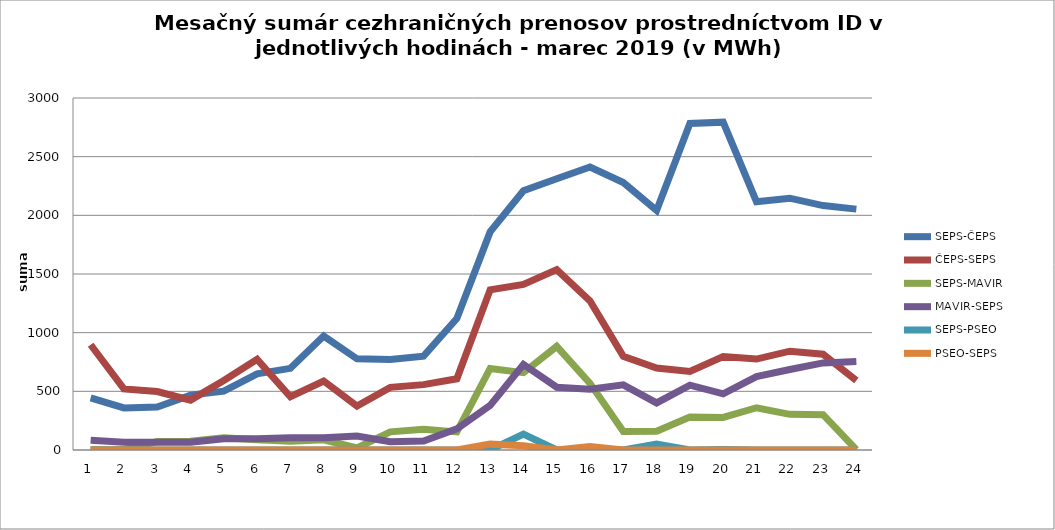
| Category | SEPS-ČEPS | ČEPS-SEPS | SEPS-MAVIR | MAVIR-SEPS | SEPS-PSEO | PSEO-SEPS |
|---|---|---|---|---|---|---|
| 1.0 | 445 | 897 | 2 | 84 | 0 | 0 |
| 2.0 | 359 | 521 | 2 | 66 | 0 | 0 |
| 3.0 | 366 | 498 | 73 | 67 | 0 | 0 |
| 4.0 | 468 | 425 | 75 | 66 | 0 | 0 |
| 5.0 | 501 | 592 | 105 | 96 | 0 | 0 |
| 6.0 | 649 | 772 | 87 | 95 | 0 | 0 |
| 7.0 | 696 | 454 | 74 | 104 | 0 | 0 |
| 8.0 | 971 | 588 | 87 | 104 | 0 | 0 |
| 9.0 | 777 | 375 | 17 | 119 | 0 | 0 |
| 10.0 | 771 | 534 | 155 | 70 | 0 | 0 |
| 11.0 | 800 | 557 | 177 | 76 | 0 | 0 |
| 12.0 | 1121 | 607 | 154 | 180 | 0 | 0 |
| 13.0 | 1859 | 1365 | 695 | 380 | 0 | 50 |
| 14.0 | 2209 | 1411 | 659 | 729 | 135 | 36 |
| 15.0 | 2312 | 1537 | 883 | 535 | 0 | 0 |
| 16.0 | 2412 | 1271 | 568 | 518 | 0 | 30 |
| 17.0 | 2279 | 799 | 157 | 555 | 0 | 0 |
| 18.0 | 2041 | 699 | 160 | 401 | 50 | 1 |
| 19.0 | 2783 | 670 | 282 | 552 | 0 | 0 |
| 20.0 | 2794 | 797 | 278 | 479 | 5 | 0 |
| 21.0 | 2116 | 775 | 360 | 626 | 0 | 0 |
| 22.0 | 2146 | 842 | 304 | 686 | 0 | 0 |
| 23.0 | 2083 | 817 | 301 | 742 | 0 | 0 |
| 24.0 | 2053 | 592 | 3 | 754 | 0 | 0 |